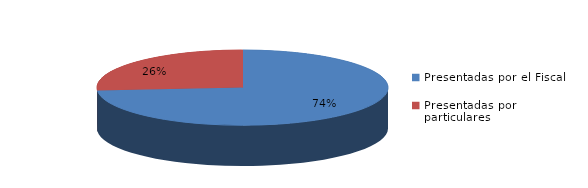
| Category | Series 0 |
|---|---|
| Presentadas por el Fiscal | 586 |
| Presentadas por particulares | 208 |